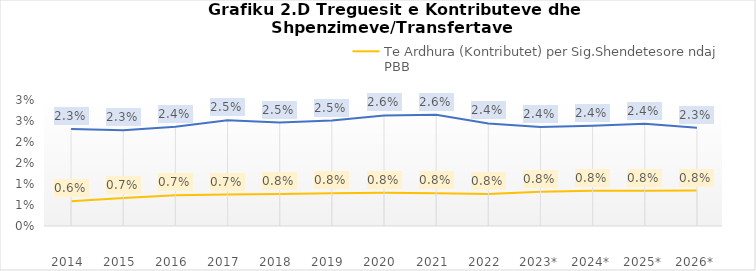
| Category | Te Ardhura (Kontributet) per Sig.Shendetesore ndaj PBB  | Shpenzime (Transferta) per Sig.Shendetesore ndaj PBB  |
|---|---|---|
| 2014  | 0.006 | 0.023 |
| 2015  | 0.007 | 0.023 |
| 2016  | 0.007 | 0.024 |
| 2017  | 0.007 | 0.025 |
| 2018  | 0.008 | 0.025 |
| 2019  | 0.008 | 0.025 |
| 2020  | 0.008 | 0.026 |
| 2021  | 0.008 | 0.026 |
| 2022  | 0.008 | 0.024 |
| 2023* | 0.008 | 0.024 |
| 2024* | 0.008 | 0.024 |
| 2025* | 0.008 | 0.024 |
| 2026* | 0.008 | 0.023 |